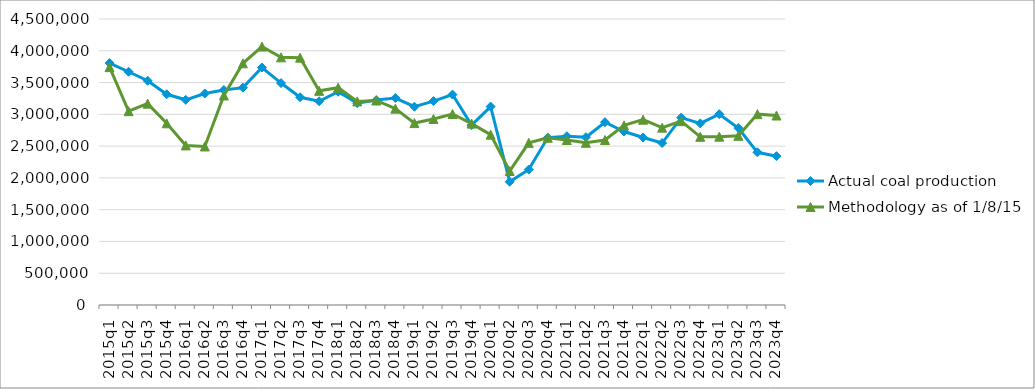
| Category | Actual coal production | Methodology as of 1/8/15 |
|---|---|---|
| 2015q1 | 3806552 | 3742575 |
| 2015q2 | 3670136 | 3049596 |
| 2015q3 | 3528489 | 3168321 |
| 2015q4 | 3315430 | 2858757 |
| 2016q1 | 3228569 | 2510901 |
| 2016q2 | 3328307 | 2494430 |
| 2016q3 | 3382605 | 3296522 |
| 2016q4 | 3419903 | 3802795 |
| 2017q1 | 3736175 | 4065887 |
| 2017q2 | 3491913 | 3896696 |
| 2017q3 | 3268590 | 3891718 |
| 2017q4 | 3205484 | 3369944 |
| 2018q1 | 3356169 | 3419255 |
| 2018q2 | 3175461 | 3203779 |
| 2018q3 | 3224265 | 3217821 |
| 2018q4 | 3256165 | 3089481 |
| 2019q1 | 3120262 | 2862254 |
| 2019q2 | 3208293 | 2926630 |
| 2019q3 | 3310874 | 3005104 |
| 2019q4 | 2829554 | 2853861 |
| 2020q1 | 3121924 | 2680043 |
| 2020q2 | 1938909 | 2108168 |
| 2020q3 | 2131872 | 2551307 |
| 2020q4 | 2634458 | 2631028 |
| 2021q1 | 2655892 | 2596261 |
| 2021q2 | 2640364 | 2552277 |
| 2021q3 | 2875989 | 2595393 |
| 2021q4 | 2729654 | 2826867 |
| 2022q1 | 2635330 | 2915982 |
| 2022q2 | 2548002 | 2790653 |
| 2022q3 | 2947971 | 2892468 |
| 2022q4 | 2857454 | 2646293 |
| 2023q1 | 3001721 | 2648753 |
| 2023q2 | 2784196 | 2661904 |
| 2023q3 | 2402427 | 3003152 |
| 2023q4 | 2341884 | 2981618 |